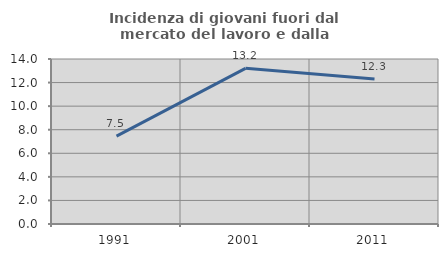
| Category | Incidenza di giovani fuori dal mercato del lavoro e dalla formazione  |
|---|---|
| 1991.0 | 7.463 |
| 2001.0 | 13.208 |
| 2011.0 | 12.308 |